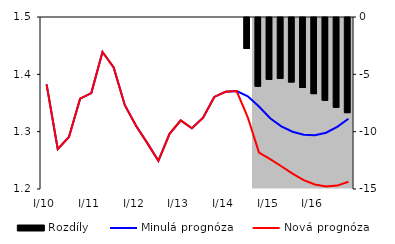
| Category | Rozdíly |
|---|---|
| 0 | 0 |
| 1 | 0 |
| 2 | 0 |
| 3 | 0 |
| 4 | 0 |
| 5 | 0 |
| 6 | 0 |
| 7 | 0 |
| 8 | 0 |
| 9 | 0 |
| 10 | 0 |
| 11 | 0 |
| 12 | 0 |
| 13 | 0 |
| 14 | 0 |
| 15 | 0 |
| 16 | 0 |
| 17 | 0 |
| 18 | -2.706 |
| 19 | -5.995 |
| 20 | -5.395 |
| 21 | -5.313 |
| 22 | -5.627 |
| 23 | -6.106 |
| 24 | -6.641 |
| 25 | -7.215 |
| 26 | -7.832 |
| 27 | -8.297 |